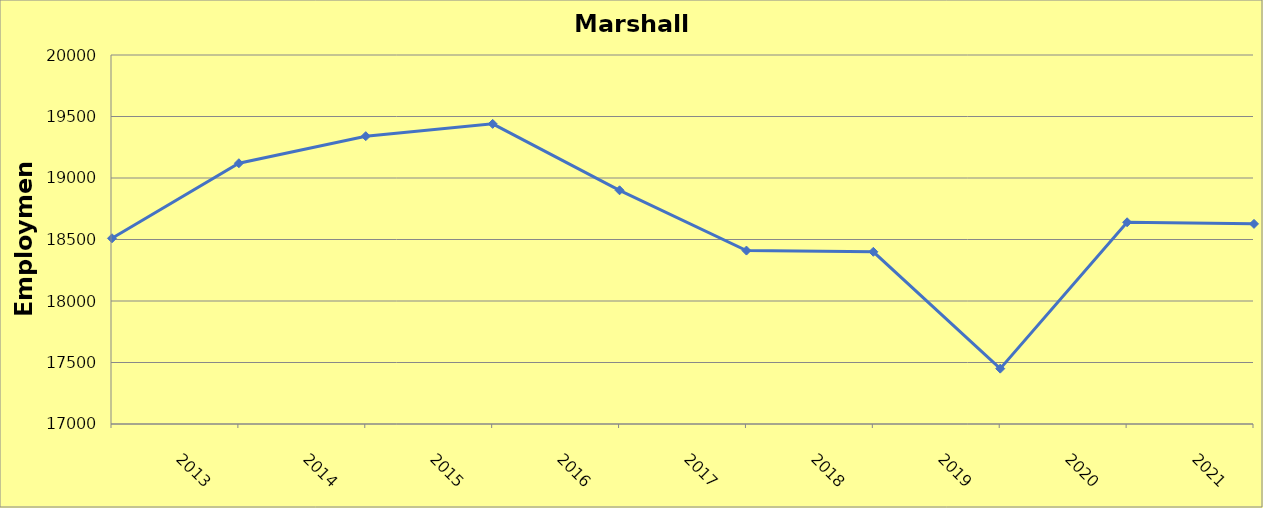
| Category | Marshall County |
|---|---|
| 2013.0 | 18510 |
| 2014.0 | 19120 |
| 2015.0 | 19340 |
| 2016.0 | 19440 |
| 2017.0 | 18900 |
| 2018.0 | 18410 |
| 2019.0 | 18400 |
| 2020.0 | 17450 |
| 2021.0 | 18640 |
| 2022.0 | 18627 |